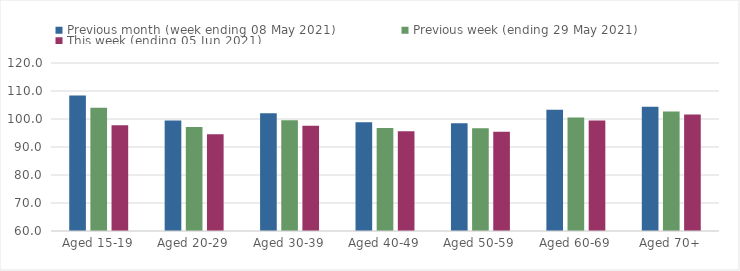
| Category | Previous month (week ending 08 May 2021) | Previous week (ending 29 May 2021) | This week (ending 05 Jun 2021) |
|---|---|---|---|
| Aged 15-19 | 108.42 | 104 | 97.8 |
| Aged 20-29 | 99.49 | 97.1 | 94.56 |
| Aged 30-39 | 102.03 | 99.53 | 97.62 |
| Aged 40-49 | 98.8 | 96.82 | 95.59 |
| Aged 50-59 | 98.52 | 96.72 | 95.43 |
| Aged 60-69 | 103.28 | 100.56 | 99.5 |
| Aged 70+ | 104.4 | 102.72 | 101.62 |